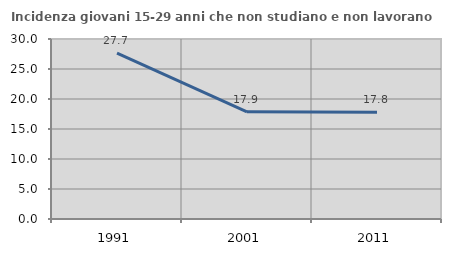
| Category | Incidenza giovani 15-29 anni che non studiano e non lavorano  |
|---|---|
| 1991.0 | 27.664 |
| 2001.0 | 17.87 |
| 2011.0 | 17.811 |